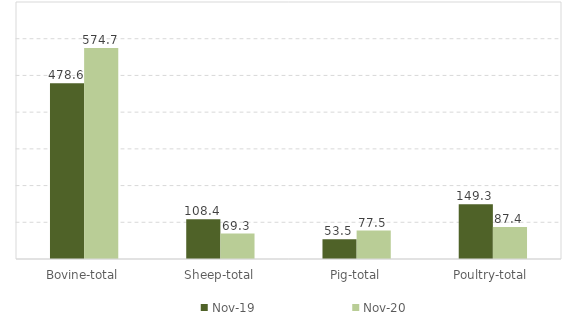
| Category | Nov-19 | Nov-20 |
|---|---|---|
| Bovine-total | 478.6 | 574.7 |
| Sheep-total | 108.4 | 69.3 |
| Pig-total | 53.5 | 77.5 |
| Poultry-total | 149.3 | 87.4 |